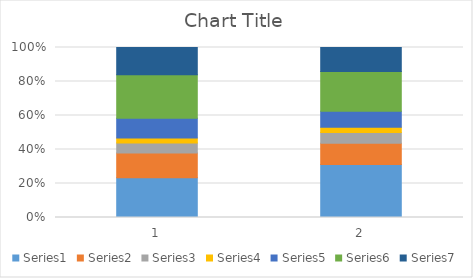
| Category | Series 0 | Series 1 | Series 2 | Series 3 | Series 4 | Series 5 | Series 6 |
|---|---|---|---|---|---|---|---|
| 0 | 32 | 20 | 8 | 4 | 16 | 35 | 22 |
| 1 | 20 | 8 | 4 | 2 | 6 | 15 | 9 |